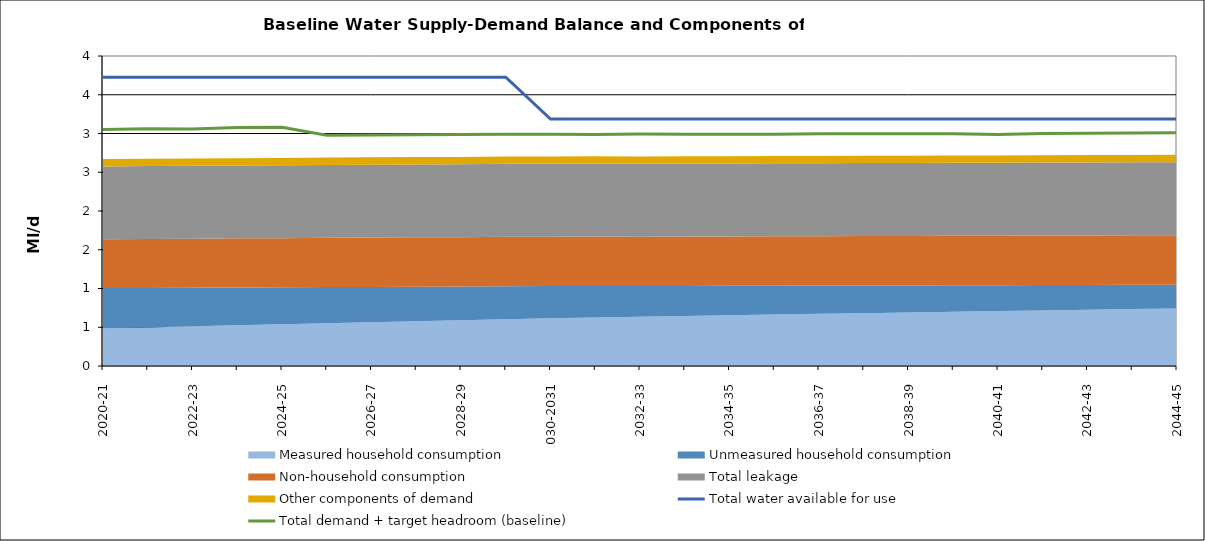
| Category | Total water available for use | Total demand + target headroom (baseline) |
|---|---|---|
| 0 | 3.726 | 3.05 |
| 1 | 3.726 | 3.063 |
| 2 | 3.726 | 3.059 |
| 3 | 3.726 | 3.078 |
| 4 | 3.726 | 3.082 |
| 5 | 3.726 | 2.979 |
| 6 | 3.726 | 2.979 |
| 7 | 3.726 | 2.985 |
| 8 | 3.726 | 2.987 |
| 9 | 3.726 | 2.989 |
| 10 | 3.186 | 2.991 |
| 11 | 3.186 | 2.986 |
| 12 | 3.186 | 2.995 |
| 13 | 3.186 | 2.991 |
| 14 | 3.186 | 2.99 |
| 15 | 3.186 | 2.989 |
| 16 | 3.186 | 2.997 |
| 17 | 3.186 | 2.996 |
| 18 | 3.186 | 2.996 |
| 19 | 3.186 | 2.997 |
| 20 | 3.186 | 2.987 |
| 21 | 3.186 | 3 |
| 22 | 3.186 | 3.003 |
| 23 | 3.186 | 3.008 |
| 24 | 3.186 | 3.011 |